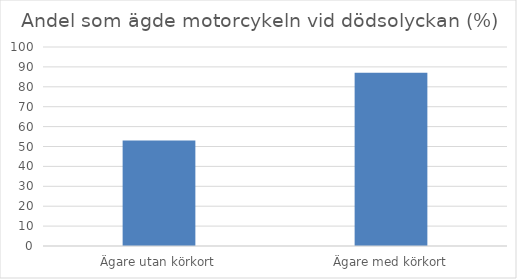
| Category | Andel % |
|---|---|
| Ägare utan körkort | 53 |
| Ägare med körkort | 87 |